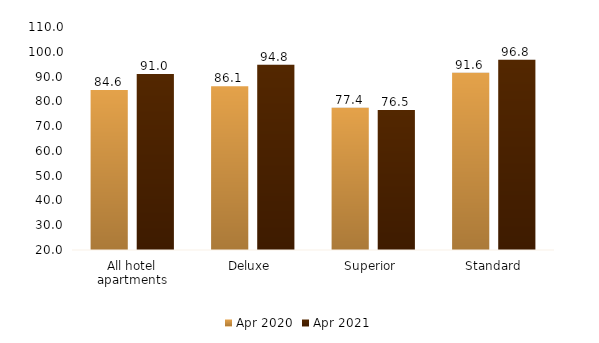
| Category | Apr 2020 | Apr 2021 |
|---|---|---|
| All hotel apartments | 84.596 | 90.996 |
| Deluxe  | 86.083 | 94.802 |
| Superior  | 77.397 | 76.528 |
| Standard | 91.571 | 96.772 |